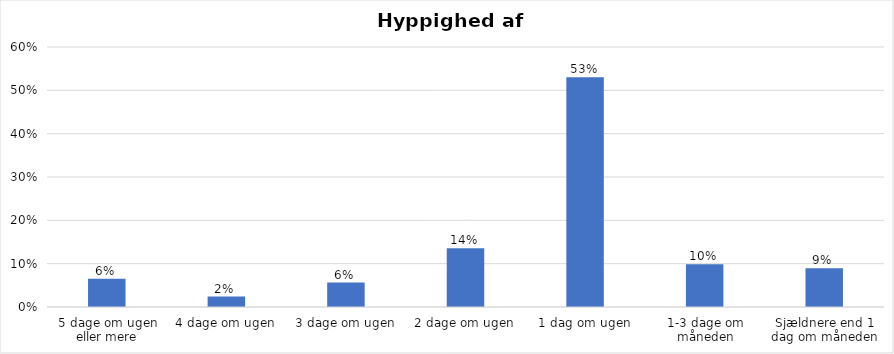
| Category | % |
|---|---|
| 5 dage om ugen eller mere | 0.065 |
| 4 dage om ugen | 0.024 |
| 3 dage om ugen | 0.056 |
| 2 dage om ugen | 0.136 |
| 1 dag om ugen | 0.53 |
| 1-3 dage om måneden | 0.099 |
| Sjældnere end 1 dag om måneden | 0.09 |